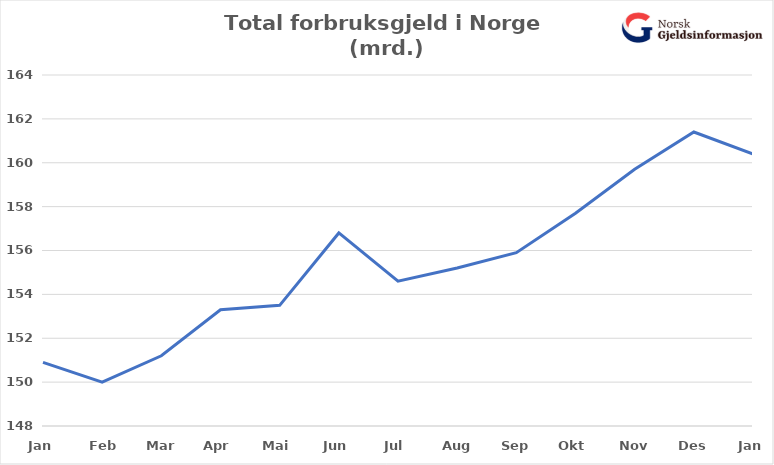
| Category | Total usikret gjeld (mrd) |
|---|---|
| Jan | 150.9 |
| Feb | 150 |
| Mar | 151.2 |
| Apr | 153.3 |
| Mai | 153.5 |
| Jun | 156.8 |
| Jul | 154.6 |
| Aug | 155.2 |
| Sep | 155.9 |
| Okt | 157.7 |
| Nov | 159.7 |
| Des | 161.4 |
| Jan | 160.4 |